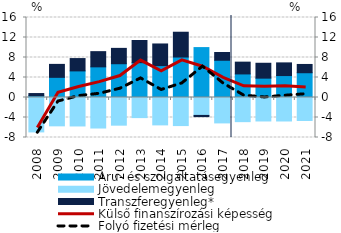
| Category | Áru- és szolgáltatásegyenleg | Jövedelemegyenleg | Transzferegyenleg* |
|---|---|---|---|
| 2008.0 | 0.357 | -6.883 | 0.435 |
| 2009.0 | 4.031 | -5.668 | 2.592 |
| 2010.0 | 5.32 | -5.693 | 2.467 |
| 2011.0 | 6.129 | -6.106 | 3.042 |
| 2012.0 | 6.755 | -5.534 | 3.07 |
| 2013.0 | 6.963 | -4.021 | 4.438 |
| 2014.0 | 6.377 | -5.477 | 4.329 |
| 2015.0 | 8.094 | -5.616 | 4.961 |
| 2016.0 | 9.982 | -3.583 | -0.238 |
| 2017.0 | 7.448 | -5.083 | 1.549 |
| 2018.0 | 4.711 | -4.832 | 2.36 |
| 2019.0 | 3.871 | -4.696 | 2.977 |
| 2020.0 | 4.387 | -4.697 | 2.536 |
| 2021.0 | 4.954 | -4.596 | 1.655 |